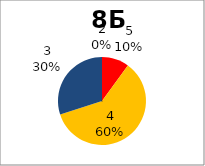
| Category | Series 0 |
|---|---|
| 5.0 | 1 |
| 4.0 | 6 |
| 3.0 | 3 |
| 2.0 | 0 |